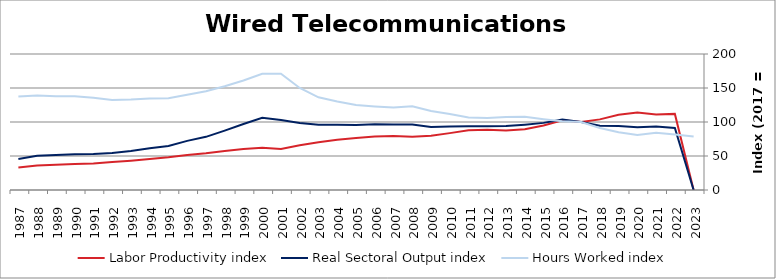
| Category | Labor Productivity index | Real Sectoral Output index | Hours Worked index |
|---|---|---|---|
| 2023.0 | 0 | 0 | 78.668 |
| 2022.0 | 111.91 | 91.238 | 81.528 |
| 2021.0 | 110.885 | 93.371 | 84.205 |
| 2020.0 | 113.893 | 92.306 | 81.046 |
| 2019.0 | 110.749 | 94.083 | 84.951 |
| 2018.0 | 103.841 | 94.656 | 91.155 |
| 2017.0 | 100 | 100 | 100 |
| 2016.0 | 102.572 | 103.572 | 100.975 |
| 2015.0 | 94.836 | 98.714 | 104.09 |
| 2014.0 | 89.257 | 96.107 | 107.675 |
| 2013.0 | 87.599 | 94.099 | 107.421 |
| 2012.0 | 88.497 | 93.832 | 106.028 |
| 2011.0 | 87.877 | 93.821 | 106.764 |
| 2010.0 | 83.647 | 93.485 | 111.762 |
| 2009.0 | 79.648 | 92.571 | 116.225 |
| 2008.0 | 78.18 | 96.29 | 123.166 |
| 2007.0 | 79.408 | 96.243 | 121.2 |
| 2006.0 | 78.617 | 96.586 | 122.856 |
| 2005.0 | 76.499 | 95.609 | 124.981 |
| 2004.0 | 73.838 | 96.028 | 130.052 |
| 2003.0 | 70.286 | 95.799 | 136.299 |
| 2002.0 | 65.658 | 98.477 | 149.983 |
| 2001.0 | 60.151 | 102.848 | 170.983 |
| 2000.0 | 62.083 | 106.086 | 170.877 |
| 1999.0 | 60.255 | 97.031 | 161.033 |
| 1998.0 | 57.191 | 87.292 | 152.633 |
| 1997.0 | 53.878 | 78.191 | 145.125 |
| 1996.0 | 51.596 | 72.235 | 140.001 |
| 1995.0 | 48.013 | 64.833 | 135.032 |
| 1994.0 | 45.457 | 61.226 | 134.691 |
| 1993.0 | 43.12 | 57.399 | 133.113 |
| 1992.0 | 41.134 | 54.496 | 132.484 |
| 1991.0 | 38.966 | 52.795 | 135.491 |
| 1990.0 | 38.058 | 52.486 | 137.913 |
| 1989.0 | 37.215 | 51.359 | 138.008 |
| 1988.0 | 36.2 | 50.258 | 138.836 |
| 1987.0 | 33.083 | 45.434 | 137.336 |